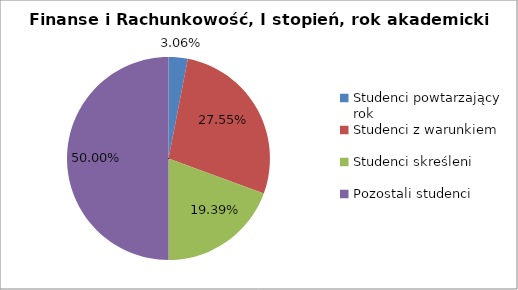
| Category | Series 0 |
|---|---|
| Studenci powtarzający rok | 3 |
| Studenci z warunkiem | 27 |
| Studenci skreśleni | 19 |
| Pozostali studenci | 49 |